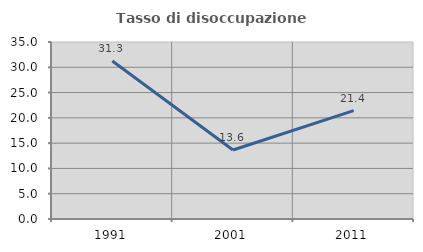
| Category | Tasso di disoccupazione giovanile  |
|---|---|
| 1991.0 | 31.25 |
| 2001.0 | 13.636 |
| 2011.0 | 21.429 |